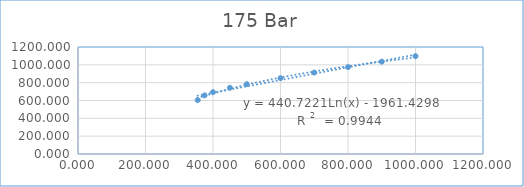
| Category | Series 0 |
|---|---|
| 354.7 | 604.228 |
| 375.0 | 657.501 |
| 400.0 | 693.359 |
| 450.0 | 743.287 |
| 500.0 | 782.776 |
| 600.0 | 850.764 |
| 700.0 | 913.402 |
| 800.0 | 974.51 |
| 900.0 | 1035.475 |
| 1000.0 | 1096.99 |